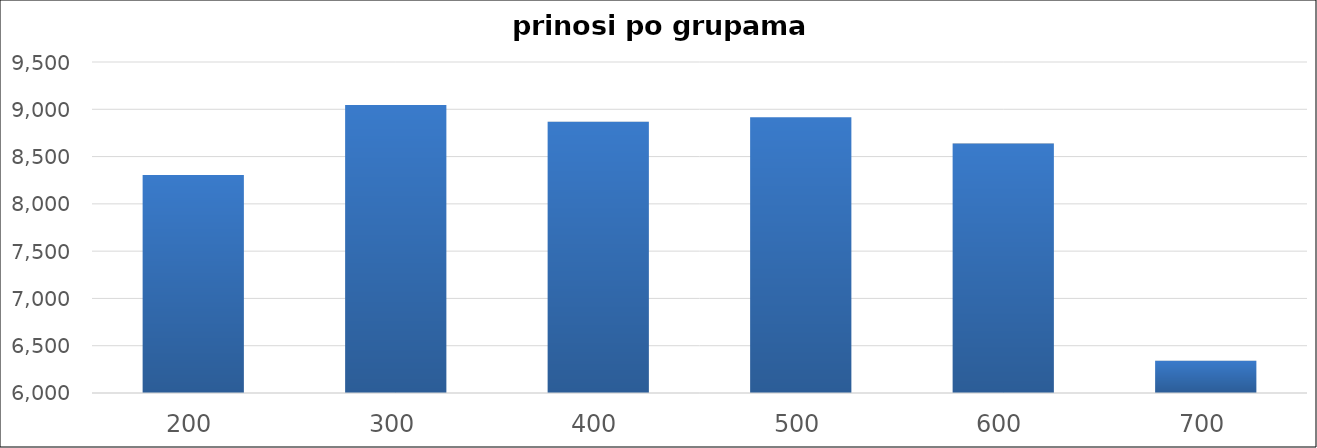
| Category | Series 0 |
|---|---|
| 200 | 8306 |
| 300 | 9044 |
| 400 | 8868 |
| 500 | 8916 |
| 600 | 8638 |
| 700 | 6342 |